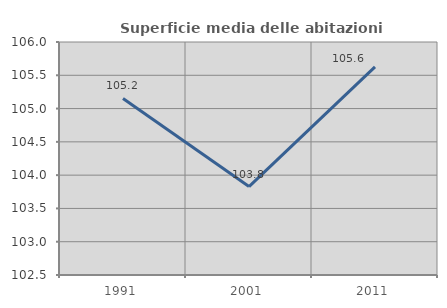
| Category | Superficie media delle abitazioni occupate |
|---|---|
| 1991.0 | 105.152 |
| 2001.0 | 103.829 |
| 2011.0 | 105.626 |